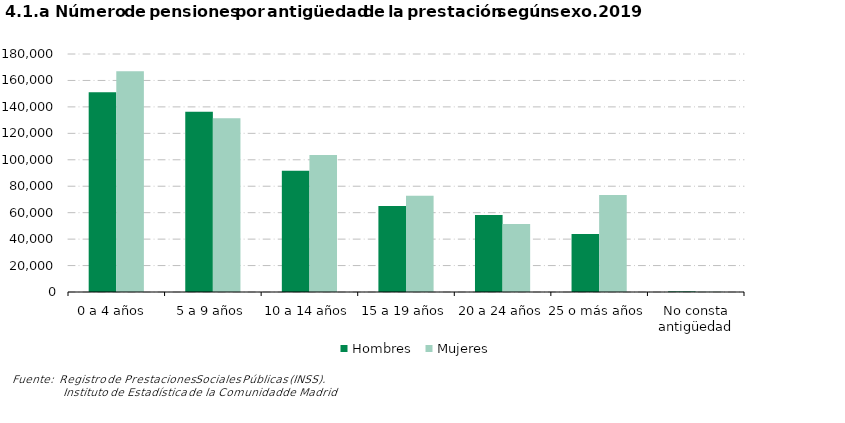
| Category | Hombres | Mujeres |
|---|---|---|
| 0 a 4 años  | 151098 | 167048 |
| 5 a 9 años | 136404 | 131386 |
| 10 a 14 años | 91729 | 103695 |
| 15 a 19 años | 65054 | 72828 |
| 20 a 24 años | 58236 | 51483 |
| 25 o más años | 43851 | 73453 |
| No consta antigüedad | 445 | 232 |